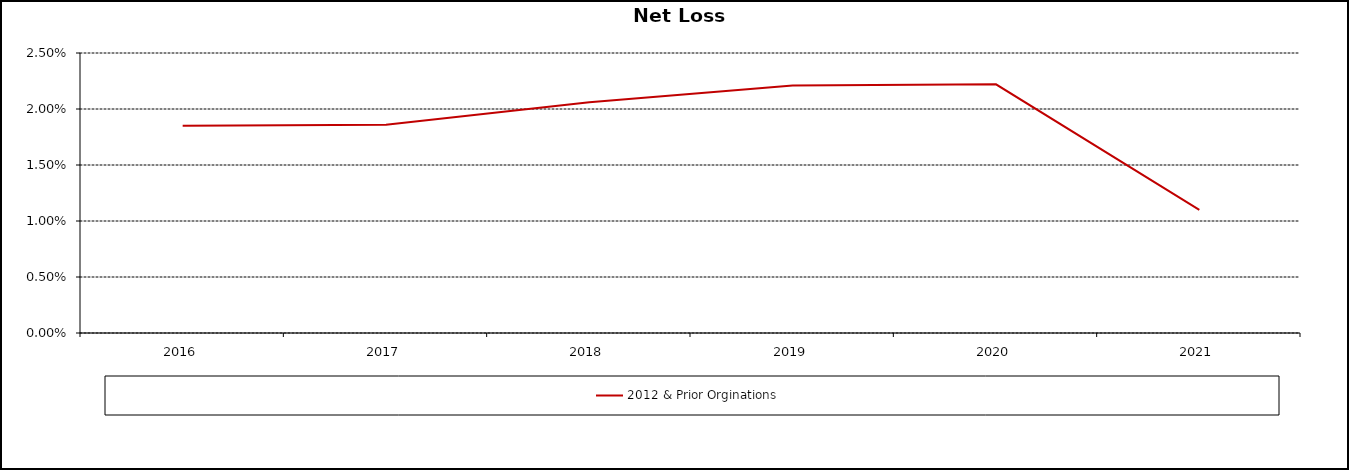
| Category | 2012 & Prior Orginations  |
|---|---|
| 2016.0 | 0.018 |
| 2017.0 | 0.019 |
| 2018.0 | 0.021 |
| 2019.0 | 0.022 |
| 2020.0 | 0.022 |
| 2021.0 | 0.011 |